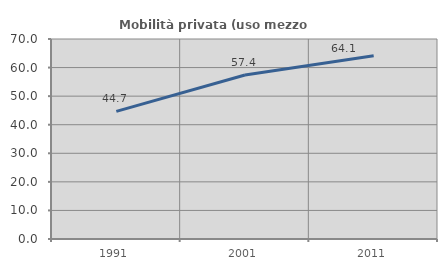
| Category | Mobilità privata (uso mezzo privato) |
|---|---|
| 1991.0 | 44.669 |
| 2001.0 | 57.416 |
| 2011.0 | 64.107 |